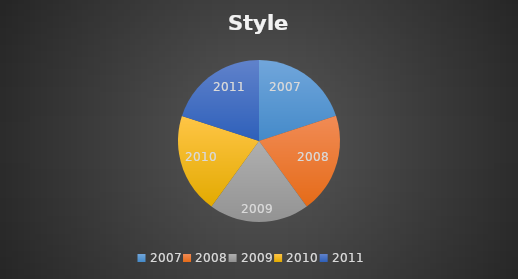
| Category | Series 0 |
|---|---|
| 2007.0 | 2007 |
| 2008.0 | 2008 |
| 2009.0 | 2009 |
| 2010.0 | 2010 |
| 2011.0 | 2011 |